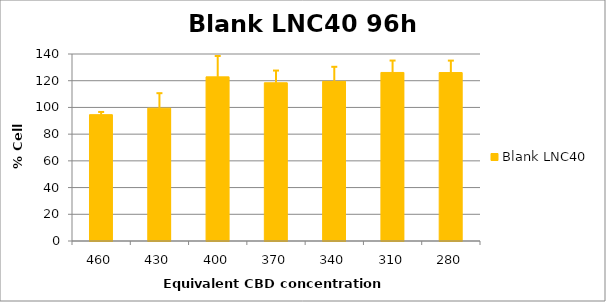
| Category | Blank LNC40 |
|---|---|
| 460.0 | 94.587 |
| 430.0 | 99.473 |
| 400.0 | 122.883 |
| 370.0 | 118.464 |
| 340.0 | 119.506 |
| 310.0 | 126.174 |
| 280.0 | 126.119 |